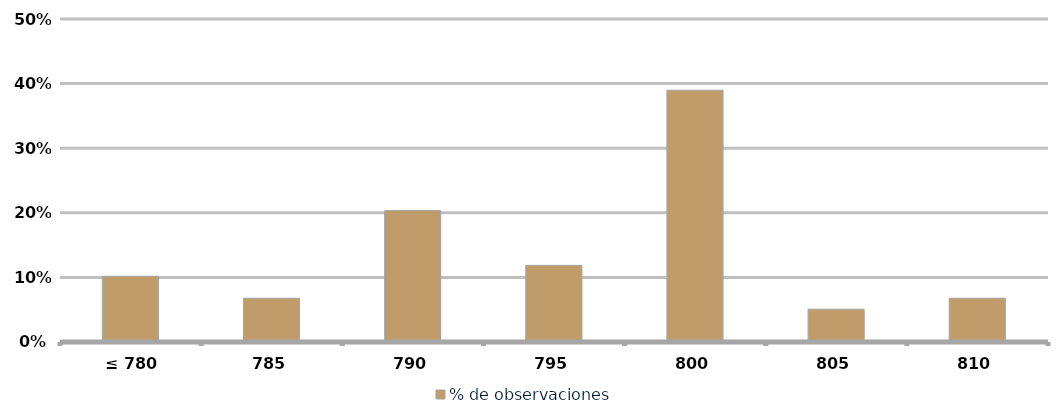
| Category | % de observaciones  |
|---|---|
|  ≤ 780  | 0.102 |
|  785  | 0.068 |
|  790  | 0.203 |
|  795  | 0.119 |
|  800  | 0.39 |
| 805 | 0.051 |
|  810  | 0.068 |